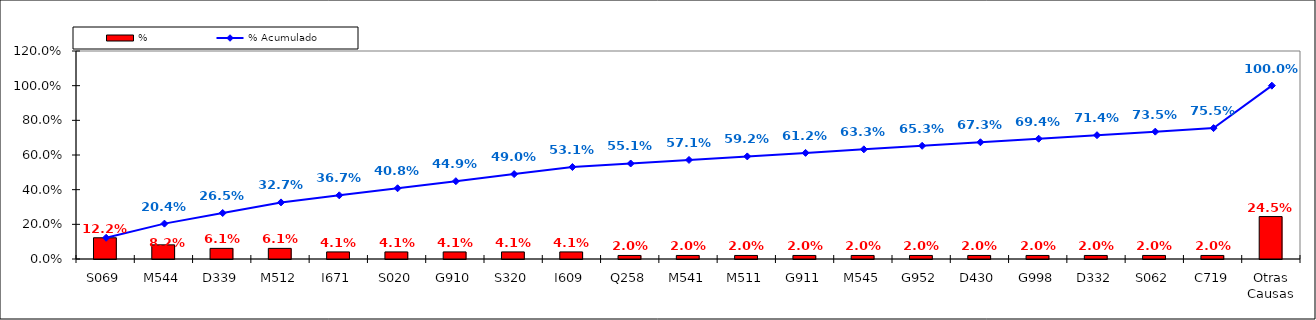
| Category | % |
|---|---|
| S069 | 0.122 |
| M544 | 0.082 |
| D339 | 0.061 |
| M512 | 0.061 |
| I671 | 0.041 |
| S020 | 0.041 |
| G910 | 0.041 |
| S320 | 0.041 |
| I609 | 0.041 |
| Q258 | 0.02 |
| M541 | 0.02 |
| M511 | 0.02 |
| G911 | 0.02 |
| M545 | 0.02 |
| G952 | 0.02 |
| D430 | 0.02 |
| G998 | 0.02 |
| D332 | 0.02 |
| S062 | 0.02 |
| C719 | 0.02 |
| Otras Causas | 0.245 |